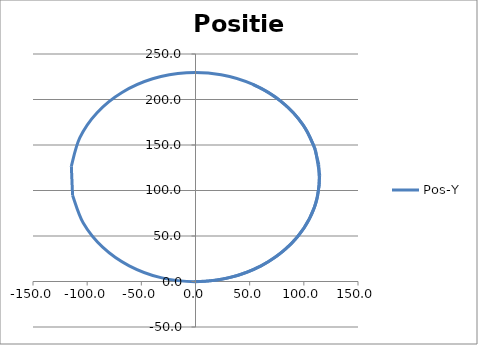
| Category | Pos-Y |
|---|---|
| 0.0 | 0 |
| 0.0 | 0 |
| 0.0 | 0 |
| 0.0 | 0 |
| 0.0 | 0 |
| 1.9999238461283426 | 0.017 |
| 5.997487154204726 | 0.157 |
| 11.978991156603493 | 0.628 |
| 19.901135706536056 | 1.741 |
| 29.66409577773539 | 3.906 |
| 41.076773973277234 | 7.614 |
| 53.816231765548835 | 13.419 |
| 67.38500130405166 | 21.898 |
| 81.07230868485222 | 33.588 |
| 93.92806087858301 | 48.909 |
| 104.7613792008593 | 68.057 |
| 112.17778706585804 | 90.882 |
| 114.66977663138387 | 116.763 |
| 110.77292980450204 | 144.49 |
| 99.29242683354934 | 172.207 |
| 79.59125962312828 | 197.423 |
| 53.70271580312996 | 216.232 |
| 23.632551937980896 | 227.177 |
| -8.289497670333478 | 229.409 |
| -39.59022089381526 | 222.756 |
| -67.84454386530092 | 207.733 |
| -90.86341747613776 | 185.504 |
| -106.86341747613777 | 157.791 |
| -114.60491813532714 | 126.741 |
| -113.4881342408471 | 94.761 |
| -103.59959042084878 | 64.327 |
| -85.70541750978491 | 37.798 |
| -61.191995329977615 | 17.229 |
| -31.958540685414384 | 4.213 |
| -0.26996248568413606 | -0.241 |
| 31.41861571404612 | 4.213 |
| 60.65207035860935 | 17.229 |
| 83.80080786024097 | 36.311 |
| 100.25879492443023 | 58.963 |
| 110.20856416592257 | 82.984 |
| 114.3761204299289 | 106.62 |
| 113.8002275671557 | 128.612 |
| 109.6419937508005 | 148.175 |
| 103.04497166976316 | 164.923 |
| 95.04497166976317 | 178.779 |
| 86.52231166364109 | 189.886 |
| 78.18641121813313 | 198.518 |
| 70.58235156213283 | 205.012 |
| 64.11021560713326 | 209.715 |
| 59.049866932255945 | 212.939 |
| 55.58576531711819 | 214.939 |
| 53.828131091794255 | 215.893 |
| 53.828131091794255 | 215.893 |
| 53.828131091794255 | 215.893 |
| 53.828131091794255 | 215.893 |
| 53.828131091794255 | 215.893 |
| 53.828131091794255 | 215.893 |